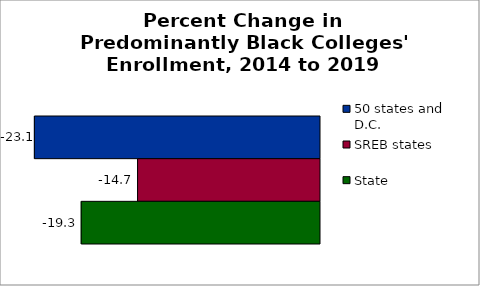
| Category | 50 states and D.C. | SREB states | State |
|---|---|---|---|
| 2014 to 2019 | -23.068 | -14.719 | -19.279 |